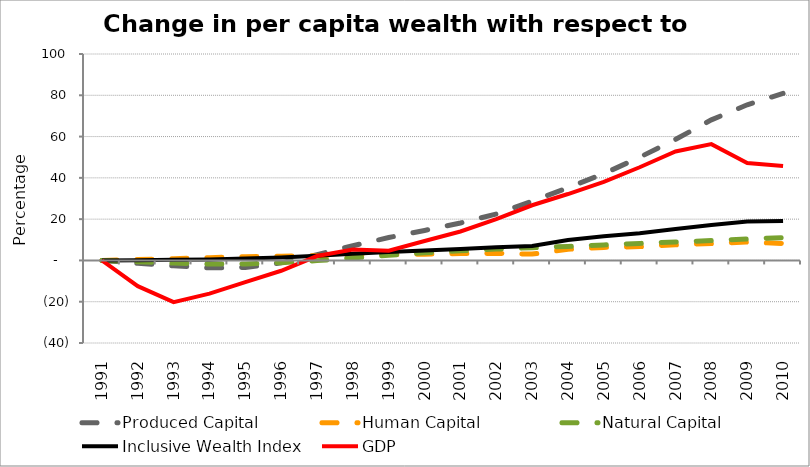
| Category | Produced Capital  | Human Capital | Natural Capital | Inclusive Wealth Index | GDP |
|---|---|---|---|---|---|
| 1991.0 | 0 | 0 | 0 | 0 | 0 |
| 1992.0 | -1.358 | 0.433 | -0.621 | 0.132 | -12.485 |
| 1993.0 | -2.626 | 0.868 | -1.278 | 0.277 | -20.218 |
| 1994.0 | -3.566 | 1.329 | -1.706 | 0.499 | -16.072 |
| 1995.0 | -3.388 | 1.81 | -1.671 | 0.92 | -10.536 |
| 1996.0 | -1.157 | 2.041 | -1.095 | 1.461 | -5.014 |
| 1997.0 | 2.795 | 2.302 | -0.095 | 2.296 | 2.132 |
| 1998.0 | 7.118 | 2.574 | 1.152 | 3.204 | 5.274 |
| 1999.0 | 11.091 | 2.827 | 2.504 | 4.048 | 4.667 |
| 2000.0 | 14.527 | 3.046 | 3.696 | 4.778 | 9.425 |
| 2001.0 | 18.13 | 3.304 | 4.674 | 5.559 | 14.031 |
| 2002.0 | 22.5 | 3.426 | 5.5 | 6.337 | 20.011 |
| 2003.0 | 28.711 | 3.067 | 6.156 | 6.991 | 26.725 |
| 2004.0 | 35.199 | 5.389 | 6.803 | 9.879 | 32.166 |
| 2005.0 | 42.038 | 6.316 | 7.492 | 11.679 | 38.056 |
| 2006.0 | 49.994 | 6.7 | 8.229 | 13.203 | 45.137 |
| 2007.0 | 58.612 | 7.583 | 8.933 | 15.233 | 52.749 |
| 2008.0 | 68.098 | 8.202 | 9.651 | 17.177 | 56.332 |
| 2009.0 | 75.41 | 8.921 | 10.352 | 18.878 | 47.216 |
| 2010.0 | 80.916 | 8.21 | 11.076 | 19.141 | 45.711 |